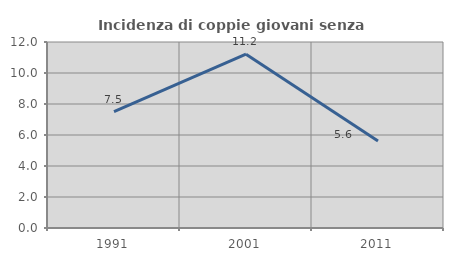
| Category | Incidenza di coppie giovani senza figli |
|---|---|
| 1991.0 | 7.502 |
| 2001.0 | 11.21 |
| 2011.0 | 5.611 |